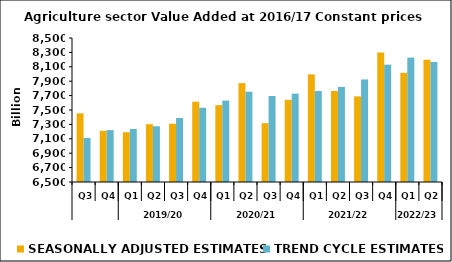
| Category | SEASONALLY ADJUSTED ESTIMATES | TREND CYCLE ESTIMATES |
|---|---|---|
| 0 | 7453.397 | 7111.365 |
| 1 | 7211.054 | 7220.463 |
| 2 | 7191.585 | 7235.897 |
| 3 | 7302.725 | 7274.193 |
| 4 | 7309.336 | 7388.961 |
| 5 | 7615.212 | 7531.097 |
| 6 | 7567.718 | 7630.593 |
| 7 | 7873.612 | 7753.493 |
| 8 | 7316.924 | 7694.374 |
| 9 | 7641.702 | 7726.946 |
| 10 | 7994.617 | 7763.005 |
| 11 | 7764.494 | 7820.561 |
| 12 | 7689.715 | 7924.255 |
| 13 | 8297.778 | 8130.011 |
| 14 | 8016.894 | 8227.597 |
| 15 | 8198.488 | 8167.613 |